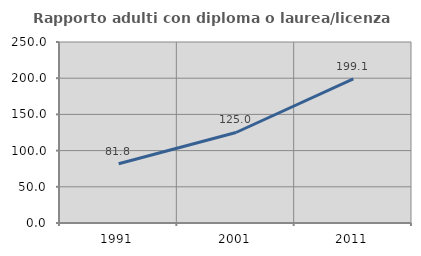
| Category | Rapporto adulti con diploma o laurea/licenza media  |
|---|---|
| 1991.0 | 81.837 |
| 2001.0 | 125.013 |
| 2011.0 | 199.081 |